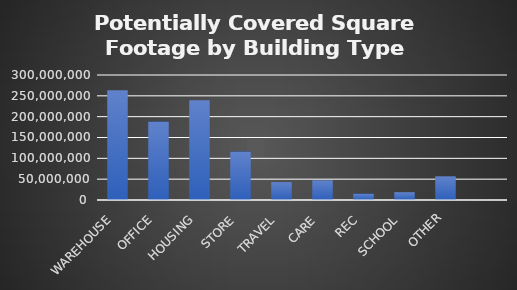
| Category | Building Sq.ft. |
|---|---|
| WAREHOUSE  | 263524250 |
| OFFICE  | 188138625 |
| HOUSING  | 239363358 |
| STORE  | 116187024 |
| TRAVEL  | 42991275 |
| CARE  | 47197318 |
| REC  | 15346383 |
| SCHOOL  | 18822254 |
| OTHER | 56875689 |